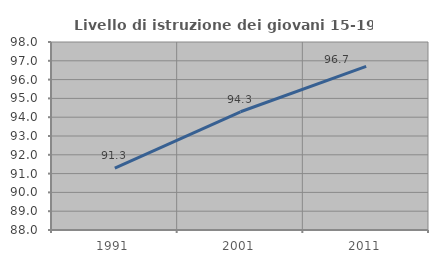
| Category | Livello di istruzione dei giovani 15-19 anni |
|---|---|
| 1991.0 | 91.289 |
| 2001.0 | 94.288 |
| 2011.0 | 96.7 |